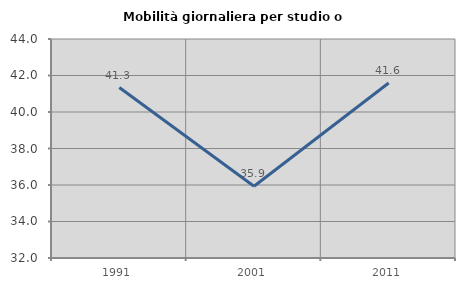
| Category | Mobilità giornaliera per studio o lavoro |
|---|---|
| 1991.0 | 41.34 |
| 2001.0 | 35.931 |
| 2011.0 | 41.586 |